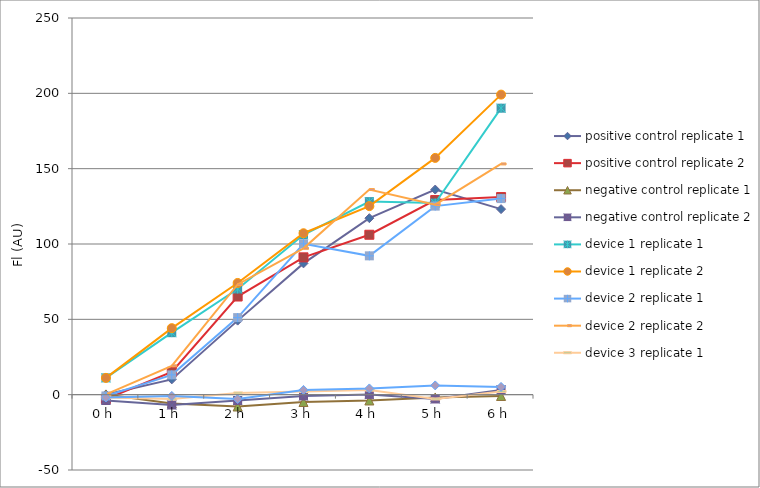
| Category | positive control | negative control | device 1 | device 2 | device 3 |
|---|---|---|---|---|---|
| 0 h | -2.857 | -3.857 | 11.143 | 0.143 | -1.857 |
| 1 h | 15.143 | -6.857 | 44.143 | 19.143 | -0.857 |
| 2 h | 65.143 | -3.857 | 74.143 | 73.143 | -2.857 |
| 3 h | 91.143 | -0.857 | 107.143 | 97.143 | 3.143 |
| 4 h | 106.143 | 0.143 | 125.143 | 136.143 | 4.143 |
| 5 h | 129.143 | -2.857 | 157.143 | 126.143 | 6.143 |
| 6 h | 131.143 | 3.143 | 199.143 | 153.143 | 5.143 |